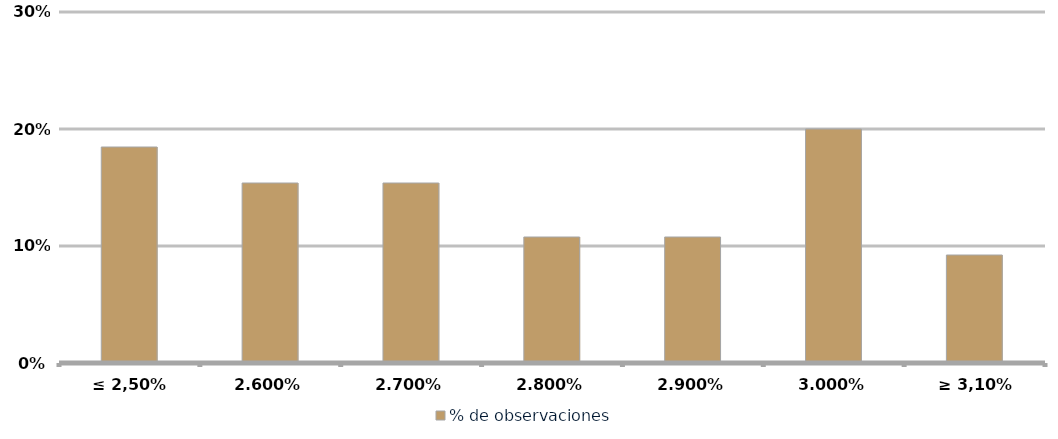
| Category | % de observaciones  |
|---|---|
| ≤ 2,50% | 0.185 |
| 2,60% | 0.154 |
| 2,70% | 0.154 |
| 2,80% | 0.108 |
| 2,90% | 0.108 |
| 3,00% | 0.2 |
| ≥ 3,10% | 0.092 |